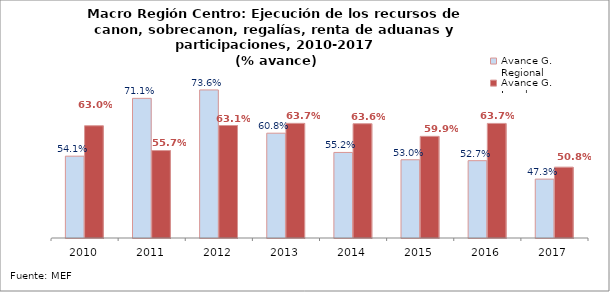
| Category | Avance G. Regional | Avance G. Locales |
|---|---|---|
| 2010 | 0.541 | 0.63 |
| 2011 | 0.711 | 0.557 |
| 2012 | 0.736 | 0.631 |
| 2013 | 0.608 | 0.637 |
| 2014 | 0.552 | 0.636 |
| 2015 | 0.53 | 0.599 |
| 2016 | 0.527 | 0.637 |
| 2017 | 0.473 | 0.508 |